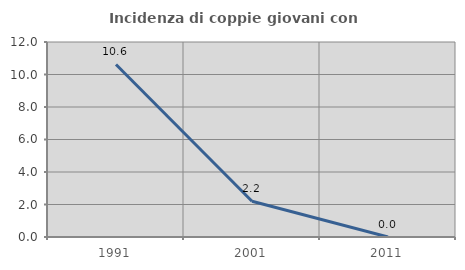
| Category | Incidenza di coppie giovani con figli |
|---|---|
| 1991.0 | 10.619 |
| 2001.0 | 2.198 |
| 2011.0 | 0 |